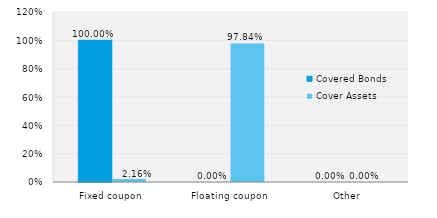
| Category | Covered Bonds | Cover Assets |
|---|---|---|
| Fixed coupon | 1 | 0.022 |
| Floating coupon | 0 | 0.978 |
| Other | 0 | 0 |